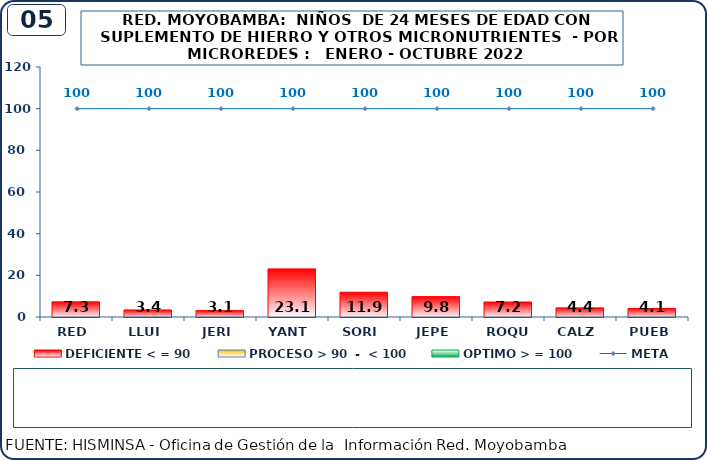
| Category | DEFICIENTE < = 90 | PROCESO > 90  -  < 100 | OPTIMO > = 100 |
|---|---|---|---|
| RED | 7.3 | 0 | 0 |
| LLUI | 3.4 | 0 | 0 |
| JERI | 3.1 | 0 | 0 |
| YANT | 23.1 | 0 | 0 |
| SORI | 11.9 | 0 | 0 |
| JEPE | 9.8 | 0 | 0 |
| ROQU | 7.2 | 0 | 0 |
| CALZ | 4.4 | 0 | 0 |
| PUEB | 4.1 | 0 | 0 |